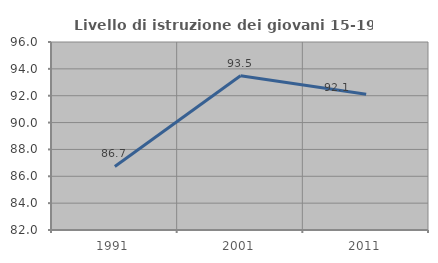
| Category | Livello di istruzione dei giovani 15-19 anni |
|---|---|
| 1991.0 | 86.733 |
| 2001.0 | 93.49 |
| 2011.0 | 92.11 |